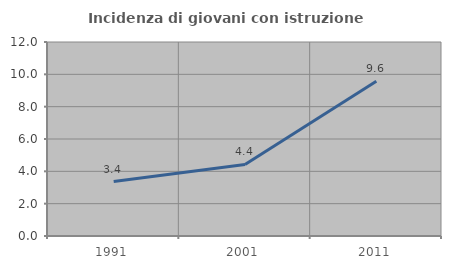
| Category | Incidenza di giovani con istruzione universitaria |
|---|---|
| 1991.0 | 3.371 |
| 2001.0 | 4.425 |
| 2011.0 | 9.574 |